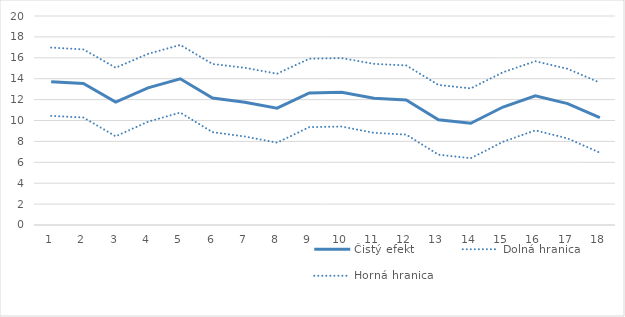
| Category | Čistý efekt | Dolná hranica | Horná hranica |
|---|---|---|---|
| 1.0 | 13.712 | 10.444 | 16.98 |
| 2.0 | 13.542 | 10.285 | 16.799 |
| 3.0 | 11.77 | 8.487 | 15.053 |
| 4.0 | 13.129 | 9.883 | 16.375 |
| 5.0 | 13.996 | 10.759 | 17.232 |
| 6.0 | 12.146 | 8.883 | 15.41 |
| 7.0 | 11.755 | 8.467 | 15.043 |
| 8.0 | 11.179 | 7.879 | 14.479 |
| 9.0 | 12.641 | 9.368 | 15.913 |
| 10.0 | 12.696 | 9.421 | 15.971 |
| 11.0 | 12.12 | 8.819 | 15.421 |
| 12.0 | 11.96 | 8.65 | 15.27 |
| 13.0 | 10.066 | 6.729 | 13.402 |
| 14.0 | 9.729 | 6.388 | 13.069 |
| 15.0 | 11.29 | 7.963 | 14.617 |
| 16.0 | 12.364 | 9.056 | 15.671 |
| 17.0 | 11.615 | 8.285 | 14.944 |
| 18.0 | 10.272 | 6.92 | 13.623 |